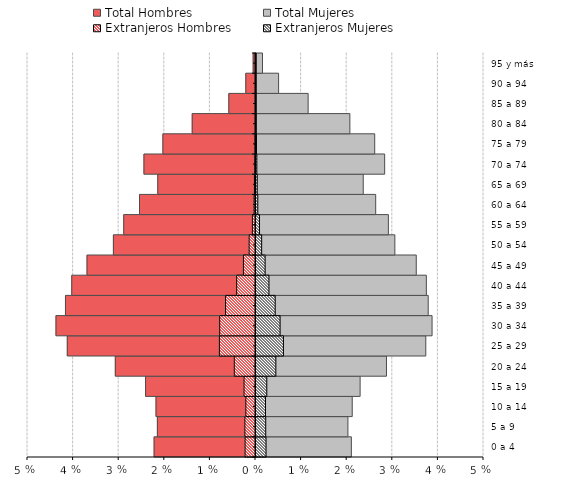
| Category | Total Hombres | Total Mujeres | Extranjeros Hombres | Extranjeros Mujeres |
|---|---|---|---|---|
| 0 a 4 | -0.022 | 0.021 | -0.002 | 0.002 |
| 5 a 9 | -0.022 | 0.02 | -0.002 | 0.002 |
| 10 a 14 | -0.022 | 0.021 | -0.002 | 0.002 |
| 15 a 19 | -0.024 | 0.023 | -0.003 | 0.002 |
| 20 a 24 | -0.031 | 0.029 | -0.005 | 0.004 |
| 25 a 29 | -0.041 | 0.037 | -0.008 | 0.006 |
| 30 a 34 | -0.044 | 0.039 | -0.008 | 0.005 |
| 35 a 39 | -0.042 | 0.038 | -0.007 | 0.004 |
| 40 a 44 | -0.04 | 0.037 | -0.004 | 0.003 |
| 45 a 49 | -0.037 | 0.035 | -0.003 | 0.002 |
| 50 a 54 | -0.031 | 0.03 | -0.001 | 0.001 |
| 55 a 59 | -0.029 | 0.029 | -0.001 | 0.001 |
| 60 a 64 | -0.025 | 0.026 | 0 | 0 |
| 65 a 69 | -0.021 | 0.024 | 0 | 0 |
| 70 a 74 | -0.024 | 0.028 | 0 | 0 |
| 75 a 79 | -0.02 | 0.026 | 0 | 0 |
| 80 a 84 | -0.014 | 0.021 | 0 | 0 |
| 85 a 89 | -0.006 | 0.011 | 0 | 0 |
| 90 a 94 | -0.002 | 0.005 | 0 | 0 |
| 95 y más | -0.001 | 0.001 | 0 | 0 |